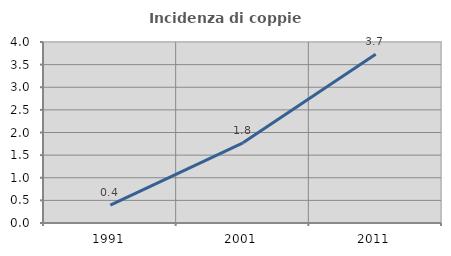
| Category | Incidenza di coppie miste |
|---|---|
| 1991.0 | 0.394 |
| 2001.0 | 1.773 |
| 2011.0 | 3.727 |